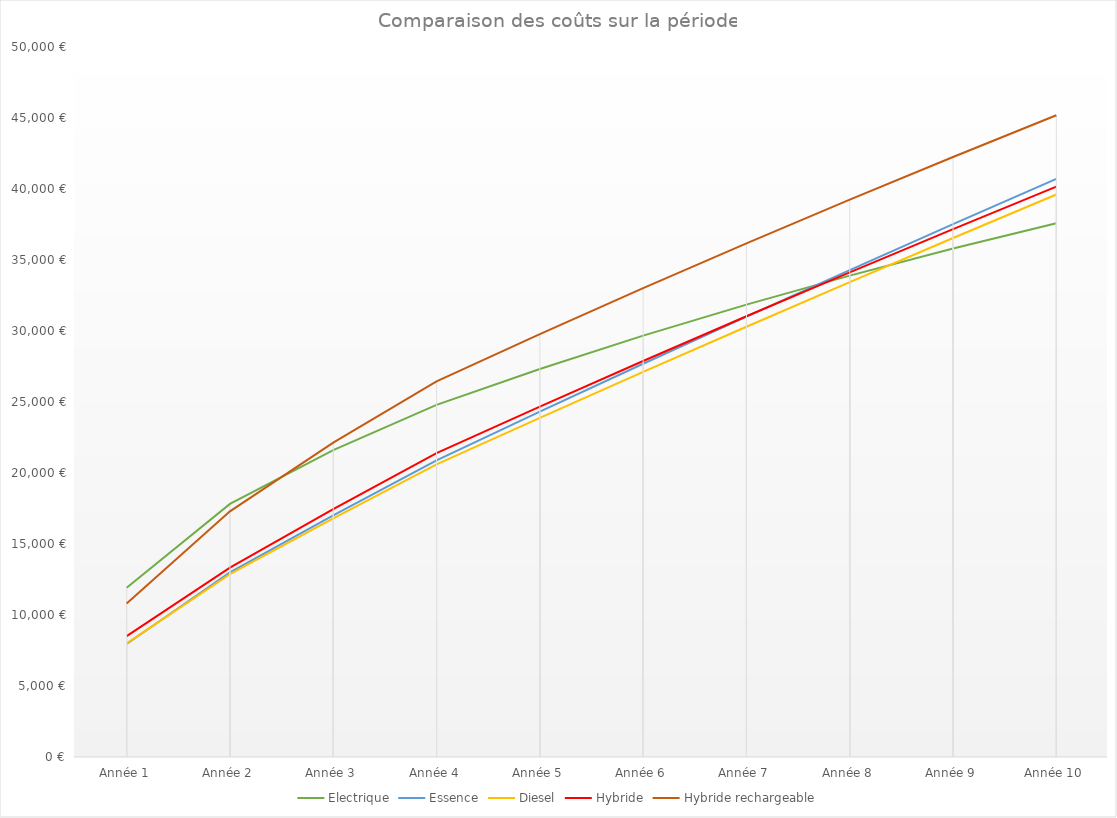
| Category | Electrique | Essence | Diesel | Hybride | Hybride rechargeable |
|---|---|---|---|---|---|
| Année 1 | 11920 | 7960 | 8000 | 8507 | 10810 |
| Année 2 | 17824 | 13005 | 12882.4 | 13333.31 | 17298.4 |
| Année 3 | 21614.08 | 17016.5 | 16809.384 | 17453.352 | 22144.592 |
| Année 4 | 24799.59 | 20892.85 | 20606.139 | 21403.11 | 26450.187 |
| Année 5 | 27327.631 | 24319.15 | 23884.971 | 24675.644 | 29777.674 |
| Année 6 | 29674.868 | 27691.81 | 27115.873 | 27885.505 | 33015.737 |
| Année 7 | 31859.381 | 31014.583 | 30301.72 | 31036.455 | 36170.635 |
| Année 8 | 33897.443 | 34290.962 | 33445.217 | 34132.028 | 39248.191 |
| Année 9 | 35803.699 | 37524.195 | 36548.904 | 37175.546 | 42253.817 |
| Année 10 | 37591.329 | 40717.301 | 39615.17 | 40170.133 | 45192.55 |